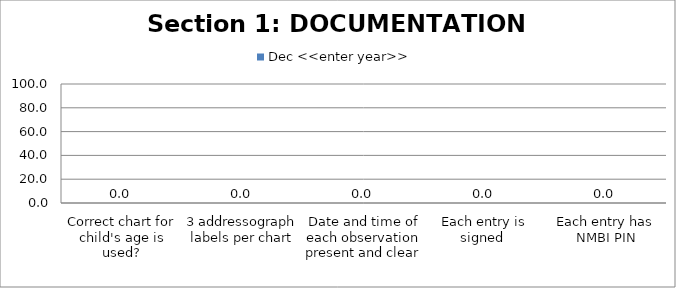
| Category | Dec <<enter year>> |
|---|---|
| Correct chart for child's age is used? | 0 |
| 3 addressograph labels per chart | 0 |
| Date and time of each observation present and clear  | 0 |
| Each entry is signed  | 0 |
| Each entry has NMBI PIN | 0 |